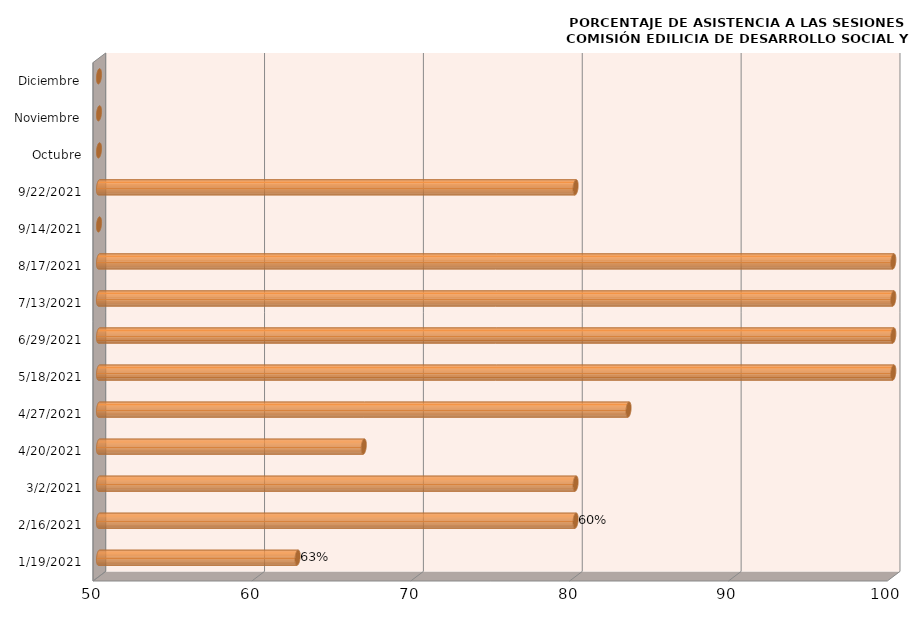
| Category | Series 0 |
|---|---|
| 19/01/2021 | 62.5 |
| 16/02/2021 | 80 |
| 02/03/2021 | 80 |
| 20/04/2021 | 66.667 |
| 27/04/2021 | 83.333 |
| 18/05/2021 | 100 |
| 29/06/2021 | 100 |
| 13/07/2021 | 100 |
| 17/08/2021 | 100 |
| 14/09/2021 | 0 |
| 22/09/2021 | 80 |
| Octubre | 0 |
| Noviembre | 0 |
| Diciembre | 0 |